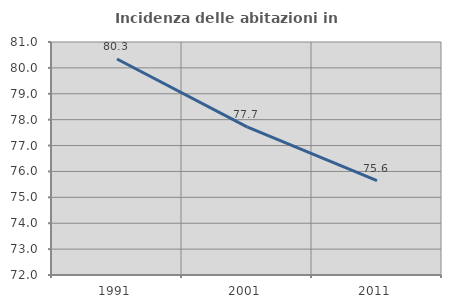
| Category | Incidenza delle abitazioni in proprietà  |
|---|---|
| 1991.0 | 80.344 |
| 2001.0 | 77.72 |
| 2011.0 | 75.648 |